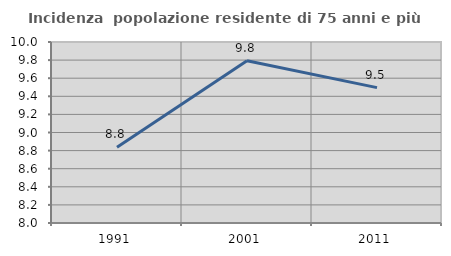
| Category | Incidenza  popolazione residente di 75 anni e più |
|---|---|
| 1991.0 | 8.838 |
| 2001.0 | 9.792 |
| 2011.0 | 9.496 |